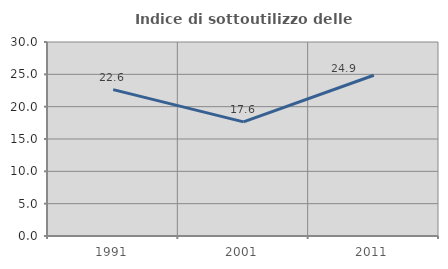
| Category | Indice di sottoutilizzo delle abitazioni  |
|---|---|
| 1991.0 | 22.642 |
| 2001.0 | 17.647 |
| 2011.0 | 24.859 |